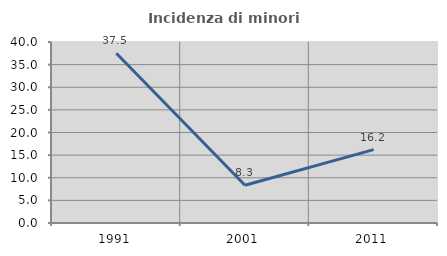
| Category | Incidenza di minori stranieri |
|---|---|
| 1991.0 | 37.5 |
| 2001.0 | 8.333 |
| 2011.0 | 16.216 |